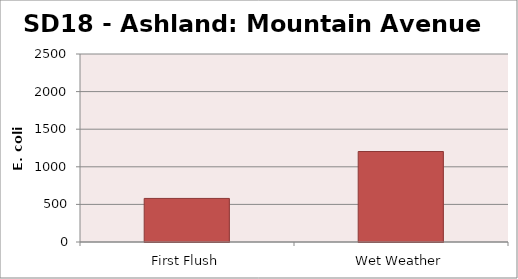
| Category | E. coli MPN - |
|---|---|
| First Flush | 579.4 |
| Wet Weather | 1203.3 |